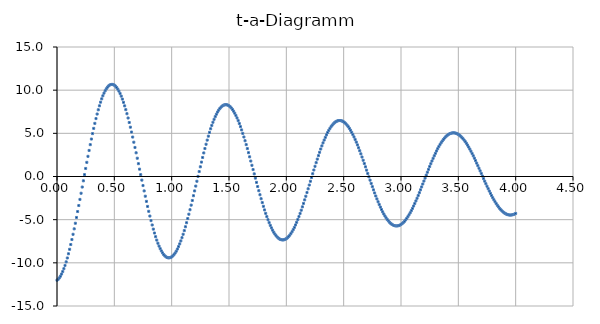
| Category | Series 0 |
|---|---|
| 0.0 | -12.01 |
| 0.01 | -11.902 |
| 0.02 | -11.747 |
| 0.03 | -11.545 |
| 0.04 | -11.299 |
| 0.05 | -11.008 |
| 0.06 | -10.675 |
| 0.07 | -10.301 |
| 0.08 | -9.888 |
| 0.09 | -9.437 |
| 0.1 | -8.95 |
| 0.11 | -8.43 |
| 0.12 | -7.88 |
| 0.13 | -7.3 |
| 0.14 | -6.694 |
| 0.15 | -6.064 |
| 0.16 | -5.413 |
| 0.17 | -4.744 |
| 0.18 | -4.059 |
| 0.19 | -3.362 |
| 0.2 | -2.654 |
| 0.21 | -1.939 |
| 0.22 | -1.22 |
| 0.23 | -0.5 |
| 0.24 | 0.219 |
| 0.25 | 0.933 |
| 0.26 | 1.639 |
| 0.27 | 2.336 |
| 0.28 | 3.02 |
| 0.29 | 3.688 |
| 0.3 | 4.339 |
| 0.31 | 4.968 |
| 0.32 | 5.575 |
| 0.33 | 6.156 |
| 0.34 | 6.71 |
| 0.35 | 7.235 |
| 0.36 | 7.727 |
| 0.37 | 8.186 |
| 0.38 | 8.611 |
| 0.39 | 8.998 |
| 0.4 | 9.348 |
| 0.41 | 9.659 |
| 0.42 | 9.929 |
| 0.43 | 10.158 |
| 0.44 | 10.346 |
| 0.45 | 10.491 |
| 0.46 | 10.594 |
| 0.47 | 10.653 |
| 0.48 | 10.67 |
| 0.49 | 10.644 |
| 0.5 | 10.576 |
| 0.51 | 10.465 |
| 0.52 | 10.313 |
| 0.53 | 10.121 |
| 0.54 | 9.889 |
| 0.55 | 9.619 |
| 0.56 | 9.312 |
| 0.57 | 8.969 |
| 0.58 | 8.592 |
| 0.59 | 8.182 |
| 0.6 | 7.742 |
| 0.61 | 7.273 |
| 0.62 | 6.777 |
| 0.63 | 6.257 |
| 0.64 | 5.714 |
| 0.65 | 5.151 |
| 0.66 | 4.57 |
| 0.67 | 3.974 |
| 0.68 | 3.365 |
| 0.69 | 2.745 |
| 0.7 | 2.118 |
| 0.71 | 1.485 |
| 0.72 | 0.849 |
| 0.73 | 0.214 |
| 0.74 | -0.42 |
| 0.75 | -1.048 |
| 0.76 | -1.669 |
| 0.77 | -2.281 |
| 0.78 | -2.88 |
| 0.790000000000001 | -3.465 |
| 0.8 | -4.033 |
| 0.810000000000001 | -4.582 |
| 0.82 | -5.11 |
| 0.83 | -5.615 |
| 0.84 | -6.094 |
| 0.850000000000001 | -6.547 |
| 0.860000000000001 | -6.972 |
| 0.87 | -7.367 |
| 0.88 | -7.73 |
| 0.890000000000001 | -8.06 |
| 0.900000000000001 | -8.357 |
| 0.910000000000001 | -8.618 |
| 0.92 | -8.844 |
| 0.930000000000001 | -9.034 |
| 0.940000000000001 | -9.186 |
| 0.950000000000001 | -9.301 |
| 0.960000000000001 | -9.378 |
| 0.970000000000001 | -9.417 |
| 0.980000000000001 | -9.418 |
| 0.990000000000001 | -9.381 |
| 1.0 | -9.308 |
| 1.01 | -9.197 |
| 1.02 | -9.05 |
| 1.03 | -8.868 |
| 1.04 | -8.651 |
| 1.05 | -8.4 |
| 1.06 | -8.118 |
| 1.07 | -7.804 |
| 1.08 | -7.46 |
| 1.09 | -7.089 |
| 1.1 | -6.69 |
| 1.11 | -6.268 |
| 1.12 | -5.822 |
| 1.13 | -5.355 |
| 1.14 | -4.869 |
| 1.15 | -4.366 |
| 1.16 | -3.848 |
| 1.17 | -3.317 |
| 1.18 | -2.776 |
| 1.19 | -2.226 |
| 1.2 | -1.67 |
| 1.21 | -1.11 |
| 1.22 | -0.549 |
| 1.23 | 0.012 |
| 1.24 | 0.57 |
| 1.25 | 1.123 |
| 1.26 | 1.669 |
| 1.27 | 2.205 |
| 1.28 | 2.73 |
| 1.29 | 3.241 |
| 1.3 | 3.737 |
| 1.31 | 4.215 |
| 1.32 | 4.674 |
| 1.33 | 5.112 |
| 1.34 | 5.528 |
| 1.35 | 5.919 |
| 1.36 | 6.285 |
| 1.37 | 6.623 |
| 1.38 | 6.934 |
| 1.39 | 7.215 |
| 1.4 | 7.466 |
| 1.41 | 7.685 |
| 1.42 | 7.873 |
| 1.43 | 8.029 |
| 1.44 | 8.151 |
| 1.45 | 8.241 |
| 1.46 | 8.297 |
| 1.47 | 8.319 |
| 1.48 | 8.308 |
| 1.49 | 8.264 |
| 1.5 | 8.187 |
| 1.51 | 8.078 |
| 1.52 | 7.937 |
| 1.53 | 7.765 |
| 1.54 | 7.563 |
| 1.55 | 7.331 |
| 1.56 | 7.072 |
| 1.57 | 6.785 |
| 1.58 | 6.473 |
| 1.59 | 6.136 |
| 1.6 | 5.776 |
| 1.61 | 5.395 |
| 1.62 | 4.995 |
| 1.63 | 4.576 |
| 1.64 | 4.142 |
| 1.65 | 3.692 |
| 1.66 | 3.231 |
| 1.67 | 2.759 |
| 1.68 | 2.278 |
| 1.69 | 1.79 |
| 1.7 | 1.298 |
| 1.71 | 0.802 |
| 1.72 | 0.307 |
| 1.73 | -0.188 |
| 1.74 | -0.679 |
| 1.75 | -1.165 |
| 1.76 | -1.645 |
| 1.77 | -2.115 |
| 1.78 | -2.574 |
| 1.79 | -3.021 |
| 1.8 | -3.453 |
| 1.81 | -3.87 |
| 1.82 | -4.268 |
| 1.83 | -4.648 |
| 1.84 | -5.007 |
| 1.85 | -5.345 |
| 1.86 | -5.659 |
| 1.87 | -5.95 |
| 1.88 | -6.215 |
| 1.89 | -6.453 |
| 1.9 | -6.665 |
| 1.91 | -6.849 |
| 1.92 | -7.005 |
| 1.93 | -7.132 |
| 1.94 | -7.23 |
| 1.95 | -7.298 |
| 1.96 | -7.337 |
| 1.97 | -7.346 |
| 1.98 | -7.326 |
| 1.99 | -7.276 |
| 2.0 | -7.198 |
| 2.01 | -7.092 |
| 2.02 | -6.957 |
| 2.03 | -6.796 |
| 2.04 | -6.608 |
| 2.05 | -6.394 |
| 2.06 | -6.156 |
| 2.07 | -5.895 |
| 2.08 | -5.611 |
| 2.09 | -5.306 |
| 2.1 | -4.982 |
| 2.11 | -4.639 |
| 2.12 | -4.28 |
| 2.13 | -3.905 |
| 2.14 | -3.516 |
| 2.15 | -3.115 |
| 2.16 | -2.704 |
| 2.17 | -2.284 |
| 2.18 | -1.857 |
| 2.19 | -1.425 |
| 2.2 | -0.989 |
| 2.21 | -0.552 |
| 2.22 | -0.114 |
| 2.23 | 0.322 |
| 2.24 | 0.754 |
| 2.25 | 1.182 |
| 2.25999999999999 | 1.602 |
| 2.26999999999999 | 2.014 |
| 2.27999999999999 | 2.416 |
| 2.28999999999999 | 2.806 |
| 2.29999999999999 | 3.183 |
| 2.30999999999999 | 3.545 |
| 2.31999999999999 | 3.891 |
| 2.32999999999999 | 4.22 |
| 2.33999999999999 | 4.531 |
| 2.34999999999999 | 4.822 |
| 2.35999999999999 | 5.092 |
| 2.36999999999999 | 5.34 |
| 2.37999999999999 | 5.566 |
| 2.38999999999999 | 5.768 |
| 2.39999999999999 | 5.946 |
| 2.40999999999999 | 6.1 |
| 2.41999999999999 | 6.228 |
| 2.42999999999999 | 6.331 |
| 2.43999999999999 | 6.408 |
| 2.44999999999999 | 6.459 |
| 2.45999999999999 | 6.484 |
| 2.46999999999999 | 6.483 |
| 2.47999999999999 | 6.456 |
| 2.48999999999999 | 6.403 |
| 2.49999999999999 | 6.325 |
| 2.50999999999999 | 6.222 |
| 2.51999999999999 | 6.095 |
| 2.52999999999999 | 5.944 |
| 2.53999999999999 | 5.77 |
| 2.54999999999999 | 5.573 |
| 2.55999999999999 | 5.356 |
| 2.56999999999999 | 5.118 |
| 2.57999999999999 | 4.86 |
| 2.58999999999999 | 4.585 |
| 2.59999999999999 | 4.292 |
| 2.60999999999999 | 3.984 |
| 2.61999999999999 | 3.662 |
| 2.62999999999999 | 3.326 |
| 2.63999999999999 | 2.979 |
| 2.64999999999999 | 2.622 |
| 2.65999999999999 | 2.256 |
| 2.66999999999999 | 1.882 |
| 2.67999999999999 | 1.504 |
| 2.68999999999999 | 1.121 |
| 2.69999999999999 | 0.735 |
| 2.70999999999999 | 0.348 |
| 2.71999999999998 | -0.038 |
| 2.72999999999998 | -0.422 |
| 2.73999999999998 | -0.802 |
| 2.74999999999998 | -1.177 |
| 2.75999999999998 | -1.546 |
| 2.76999999999998 | -1.907 |
| 2.77999999999998 | -2.258 |
| 2.78999999999998 | -2.598 |
| 2.79999999999998 | -2.927 |
| 2.80999999999998 | -3.242 |
| 2.81999999999998 | -3.542 |
| 2.82999999999998 | -3.827 |
| 2.83999999999998 | -4.095 |
| 2.84999999999998 | -4.345 |
| 2.85999999999998 | -4.577 |
| 2.86999999999998 | -4.789 |
| 2.87999999999998 | -4.981 |
| 2.88999999999998 | -5.152 |
| 2.89999999999998 | -5.302 |
| 2.90999999999998 | -5.43 |
| 2.91999999999998 | -5.535 |
| 2.92999999999998 | -5.618 |
| 2.93999999999998 | -5.678 |
| 2.94999999999998 | -5.714 |
| 2.95999999999998 | -5.728 |
| 2.96999999999998 | -5.719 |
| 2.97999999999998 | -5.687 |
| 2.98999999999998 | -5.632 |
| 2.99999999999998 | -5.555 |
| 3.00999999999998 | -5.456 |
| 3.01999999999998 | -5.336 |
| 3.02999999999998 | -5.196 |
| 3.03999999999998 | -5.035 |
| 3.04999999999998 | -4.854 |
| 3.05999999999998 | -4.656 |
| 3.06999999999998 | -4.439 |
| 3.07999999999998 | -4.206 |
| 3.08999999999998 | -3.958 |
| 3.09999999999998 | -3.694 |
| 3.10999999999998 | -3.417 |
| 3.11999999999998 | -3.128 |
| 3.12999999999998 | -2.828 |
| 3.13999999999998 | -2.518 |
| 3.14999999999998 | -2.2 |
| 3.15999999999998 | -1.874 |
| 3.16999999999998 | -1.543 |
| 3.17999999999998 | -1.207 |
| 3.18999999999997 | -0.868 |
| 3.19999999999997 | -0.527 |
| 3.20999999999997 | -0.185 |
| 3.21999999999997 | 0.155 |
| 3.22999999999997 | 0.493 |
| 3.23999999999997 | 0.828 |
| 3.24999999999997 | 1.157 |
| 3.25999999999997 | 1.48 |
| 3.26999999999997 | 1.796 |
| 3.27999999999997 | 2.103 |
| 3.28999999999997 | 2.4 |
| 3.29999999999997 | 2.685 |
| 3.30999999999997 | 2.959 |
| 3.31999999999997 | 3.22 |
| 3.32999999999997 | 3.466 |
| 3.33999999999997 | 3.697 |
| 3.34999999999997 | 3.912 |
| 3.35999999999997 | 4.111 |
| 3.36999999999997 | 4.292 |
| 3.37999999999997 | 4.455 |
| 3.38999999999997 | 4.599 |
| 3.39999999999997 | 4.724 |
| 3.40999999999997 | 4.83 |
| 3.41999999999997 | 4.916 |
| 3.42999999999997 | 4.982 |
| 3.43999999999997 | 5.027 |
| 3.44999999999997 | 5.052 |
| 3.45999999999997 | 5.057 |
| 3.46999999999997 | 5.042 |
| 3.47999999999997 | 5.006 |
| 3.48999999999997 | 4.951 |
| 3.49999999999997 | 4.876 |
| 3.50999999999997 | 4.782 |
| 3.51999999999997 | 4.67 |
| 3.52999999999997 | 4.539 |
| 3.53999999999997 | 4.391 |
| 3.54999999999997 | 4.225 |
| 3.55999999999997 | 4.044 |
| 3.56999999999997 | 3.848 |
| 3.57999999999997 | 3.637 |
| 3.58999999999997 | 3.413 |
| 3.59999999999997 | 3.176 |
| 3.60999999999997 | 2.927 |
| 3.61999999999997 | 2.668 |
| 3.62999999999997 | 2.4 |
| 3.63999999999997 | 2.124 |
| 3.64999999999997 | 1.84 |
| 3.65999999999996 | 1.551 |
| 3.66999999999996 | 1.256 |
| 3.67999999999996 | 0.958 |
| 3.68999999999996 | 0.658 |
| 3.69999999999996 | 0.357 |
| 3.70999999999996 | 0.056 |
| 3.71999999999996 | -0.244 |
| 3.72999999999996 | -0.542 |
| 3.73999999999996 | -0.836 |
| 3.74999999999996 | -1.125 |
| 3.75999999999996 | -1.408 |
| 3.76999999999996 | -1.684 |
| 3.77999999999996 | -1.952 |
| 3.78999999999996 | -2.211 |
| 3.79999999999996 | -2.459 |
| 3.80999999999996 | -2.697 |
| 3.81999999999996 | -2.922 |
| 3.82999999999996 | -3.135 |
| 3.83999999999996 | -3.334 |
| 3.84999999999996 | -3.519 |
| 3.85999999999996 | -3.689 |
| 3.86999999999996 | -3.843 |
| 3.87999999999996 | -3.981 |
| 3.88999999999996 | -4.103 |
| 3.89999999999996 | -4.207 |
| 3.90999999999996 | -4.294 |
| 3.91999999999996 | -4.364 |
| 3.92999999999996 | -4.415 |
| 3.93999999999996 | -4.449 |
| 3.94999999999996 | -4.465 |
| 3.95999999999996 | -4.463 |
| 3.96999999999996 | -4.443 |
| 3.97999999999996 | -4.405 |
| 3.98999999999996 | -4.35 |
| 3.99999999999996 | -4.278 |